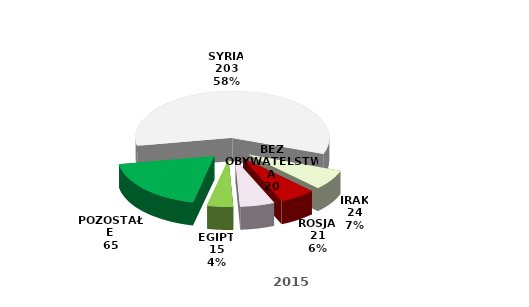
| Category | Series 0 |
|---|---|
| SYRIA | 203 |
| IRAK | 24 |
| ROSJA | 21 |
| BEZ OBYWATELSTWA | 20 |
| EGIPT | 15 |
| POZOSTAŁE | 65 |